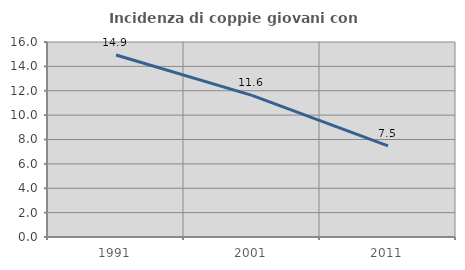
| Category | Incidenza di coppie giovani con figli |
|---|---|
| 1991.0 | 14.938 |
| 2001.0 | 11.624 |
| 2011.0 | 7.477 |